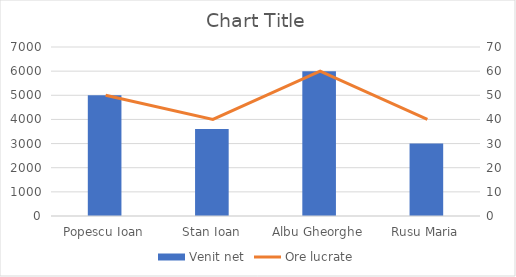
| Category | Venit net |
|---|---|
| Popescu Ioan | 5000 |
| Stan Ioan | 3600 |
| Albu Gheorghe | 6000 |
| Rusu Maria | 3000 |